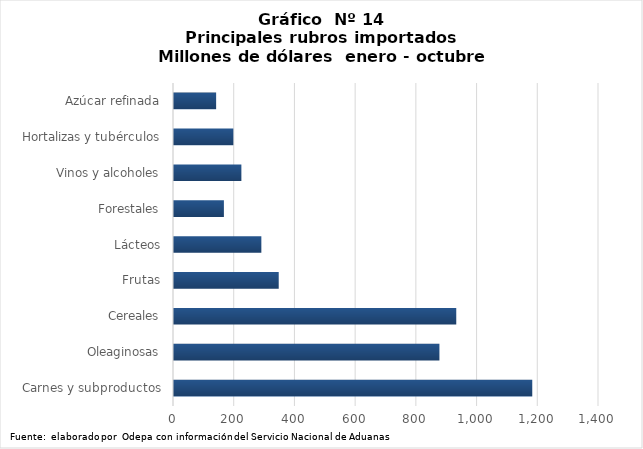
| Category | Series 0 |
|---|---|
| Carnes y subproductos | 1180164.675 |
| Oleaginosas | 874340.728 |
| Cereales | 929802.691 |
| Frutas | 344963.188 |
| Lácteos | 287752.872 |
| Forestales | 164357 |
| Vinos y alcoholes | 221966.744 |
| Hortalizas y tubérculos | 195445.797 |
| Azúcar refinada | 138793.282 |